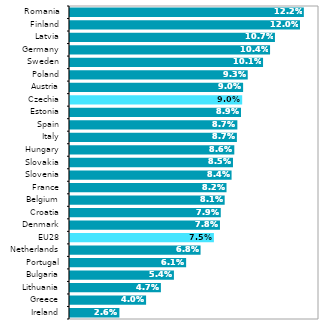
| Category | 2018* |
|---|---|
| Ireland | 0.026 |
| Greece | 0.04 |
| Lithuania | 0.047 |
| Bulgaria | 0.054 |
| Portugal | 0.061 |
| Netherlands | 0.068 |
| EU28 | 0.075 |
| Denmark | 0.078 |
| Croatia | 0.079 |
| Belgium | 0.081 |
| France | 0.082 |
| Slovenia | 0.084 |
| Slovakia | 0.085 |
| Hungary | 0.086 |
| Italy | 0.087 |
| Spain | 0.087 |
| Estonia | 0.089 |
| Czechia | 0.09 |
| Austria | 0.09 |
| Poland | 0.093 |
| Sweden | 0.101 |
| Germany | 0.104 |
| Latvia | 0.107 |
| Finland | 0.12 |
| Romania | 0.122 |